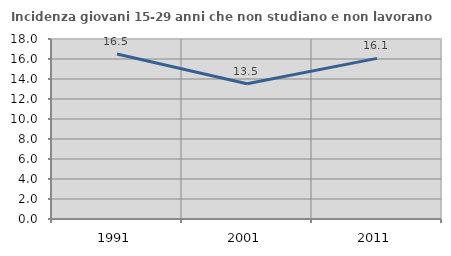
| Category | Incidenza giovani 15-29 anni che non studiano e non lavorano  |
|---|---|
| 1991.0 | 16.499 |
| 2001.0 | 13.517 |
| 2011.0 | 16.065 |